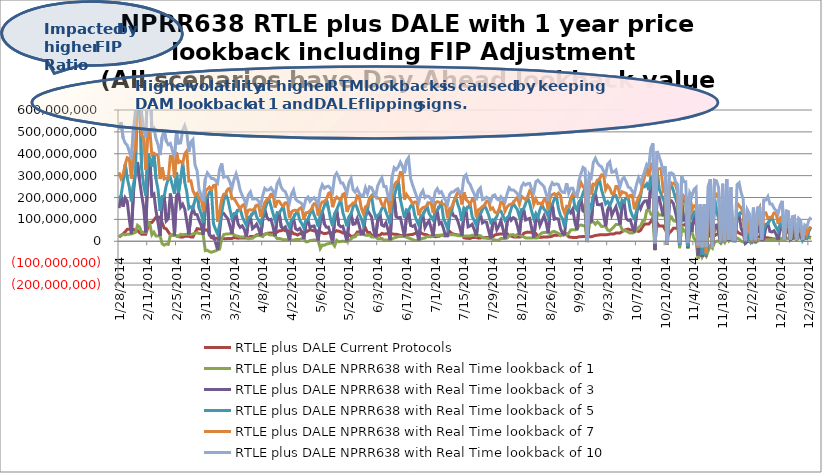
| Category | RTLE plus DALE Current Protocols | RTLE plus DALE NPRR638 with Real Time lookback of 1 | RTLE plus DALE NPRR638 with Real Time lookback of 3 | RTLE plus DALE NPRR638 with Real Time lookback of 5 | RTLE plus DALE NPRR638 with Real Time lookback of 7 | RTLE plus DALE NPRR638 with Real Time lookback of 10 |
|---|---|---|---|---|---|---|
| 1/28/14 | 18516424.113 | 20330707.317 | 151345566.711 | 194267535.615 | 315001352.258 | 510449728.574 |
| 1/29/14 | 26165652.225 | 28394407.036 | 209290560.988 | 209290560.988 | 286805051.687 | 544486130.82 |
| 1/30/14 | 33951592.112 | 30929923.618 | 158593541.433 | 270871903.741 | 305898755.766 | 471214211.662 |
| 1/31/14 | 43045783.01 | 29335787.17 | 198404084.302 | 351010505.149 | 351010505.149 | 449435839.337 |
| 2/1/14 | 54769080.035 | 32079503.261 | 182444401.404 | 288568876.6 | 381832253.594 | 438304825.56 |
| 2/2/14 | 54769080.035 | 32477531.017 | 100375771.106 | 247352723.153 | 378514968.837 | 410881427.76 |
| 2/3/14 | 54769080.035 | 32958092.885 | 32958092.885 | 181744694.462 | 286806381.395 | 378995530.705 |
| 2/4/14 | 54867904.896 | 37097715.499 | 218691239.193 | 258263628.802 | 395609754.08 | 508478816.403 |
| 2/5/14 | 44459964.79 | 40359369.437 | 311094978.796 | 311094978.796 | 420896675.799 | 594026171.099 |
| 2/6/14 | 48889341.468 | 72675738.867 | 362198280.329 | 643759064.74 | 707493834.426 | 993655725.667 |
| 2/7/14 | 39654347.796 | 64970253.927 | 278946250.254 | 699083454.768 | 699083454.768 | 971623958.546 |
| 2/8/14 | 32006154.249 | 39934503.455 | 212222773.758 | 332959676.231 | 483853013.206 | 586670284.027 |
| 2/9/14 | 32006154.249 | 40981731.458 | 155738895.703 | 256948164.716 | 474616851.646 | 507620672.726 |
| 2/10/14 | 32006154.249 | 40916190.632 | 40916190.632 | 209350489.46 | 327038241.942 | 474551310.82 |
| 2/11/14 | 63028979.82 | 87927844.322 | 308642414.784 | 401999687.803 | 503192402.154 | 728062333.704 |
| 2/12/14 | 85547610.904 | 79537844.16 | 375582470.159 | 375582470.159 | 506016148.574 | 763431237.924 |
| 2/13/14 | 85937272.747 | 29348735.909 | 208599565.803 | 341747944.915 | 396115730.063 | 505158660.665 |
| 2/14/14 | 97417042.342 | 41262300.775 | 215989249.577 | 402590811.167 | 402590811.167 | 515454131.563 |
| 2/15/14 | 109654336.546 | 24218108.647 | 138840936.911 | 285133676.496 | 395301117.933 | 468952261.305 |
| 2/16/14 | 109654336.546 | 24484932.818 | 85163582.601 | 235201437.643 | 394967266.468 | 441223520.774 |
| 2/17/14 | 109654336.546 | 24794770.497 | 24794770.497 | 138660851.252 | 284303849.806 | 393970296.74 |
| 2/18/14 | 84640835.996 | -11290271.301 | 167478037.681 | 204811356.556 | 337790670.788 | 476041026.148 |
| 2/19/14 | 60344140.354 | -17397708.767 | 206949939.56 | 206949939.56 | 284692722.486 | 507561405.727 |
| 2/20/14 | 56842811.04 | -12475554.518 | 92984535.263 | 254569850.251 | 288782354.897 | 457777882.832 |
| 2/21/14 | 42485541.507 | -14148140.001 | 102665682.394 | 285933411.007 | 285933411.007 | 441071128.325 |
| 2/22/14 | 29104966.55 | 27487991.19 | 217716432.548 | 290388546.838 | 387649237.601 | 447078296.967 |
| 2/23/14 | 29104966.55 | 27327032.055 | 150066010.705 | 255309669.456 | 387339087.376 | 414902291.627 |
| 2/24/14 | 29104966.55 | 26732602.836 | 26732602.836 | 216887267.133 | 289526103.69 | 386744658.157 |
| 2/25/14 | 23864162.506 | 25904433.162 | 207215218.911 | 314935981.209 | 405875778.09 | 495179155.175 |
| 2/26/14 | 21068769.319 | 22962403.588 | 223021497.881 | 223021497.881 | 359796534.422 | 447815274.077 |
| 2/27/14 | 19355877.946 | 31949081.19 | 155649601.338 | 284306538.797 | 364363115.337 | 449668883.838 |
| 2/28/14 | 18802534.063 | 29381985.458 | 169129150.79 | 355118534.124 | 355118534.124 | 505635708.191 |
| 3/1/14 | 23128178.094 | 30939116.203 | 147255303.008 | 269190832.453 | 399478222.496 | 528165907.634 |
| 3/2/14 | 23128178.094 | 32204613.198 | 89689180.811 | 226139721.968 | 412548824.967 | 498574966.452 |
| 3/3/14 | 23128178.094 | 31348157.695 | 31348157.695 | 150339671.89 | 275076523.786 | 408383374.233 |
| 3/4/14 | 19411967.958 | 30943641.771 | 116953093.664 | 157709491.879 | 276216245.475 | 453379870.294 |
| 3/5/14 | 19581333.766 | 33466239.239 | 150910025.202 | 150910025.202 | 231301701.625 | 464331142.325 |
| 3/6/14 | 38369816.469 | 34329404.266 | 123097372.651 | 188645014.77 | 210856436.751 | 348997538.712 |
| 3/7/14 | 57550185.653 | 40094816.396 | 121830532.859 | 219101540.859 | 219101540.859 | 323238199.091 |
| 3/8/14 | 56044264.844 | 35218835.025 | 94395349.335 | 151249373.934 | 195852348.264 | 236025138.006 |
| 3/9/14 | 56044264.844 | 35300358.394 | 74557793.723 | 125723641.615 | 195933871.633 | 210235666.693 |
| 3/10/14 | 56044264.844 | 29449859.371 | 29449859.371 | 85707170.802 | 139705670.744 | 182183000.158 |
| 3/11/14 | 50786282.858 | -42889280.836 | 165992305.302 | 191872962.849 | 228441513.468 | 284190820.857 |
| 3/12/14 | 52394012.107 | -41264388.234 | 200998782.457 | 200998782.457 | 238508988.509 | 312694670.522 |
| 3/13/14 | 35279158.185 | -47310402.091 | 27709311.952 | 223055781.824 | 247219083.917 | 299870339.026 |
| 3/14/14 | 16658128.226 | -50383602.616 | 20174490.671 | 234547850.138 | 234547850.138 | 287310521.204 |
| 3/15/14 | 13706829.115 | -46835789.758 | 23712364.396 | 79935691.93 | 254521376.051 | 286518839.583 |
| 3/16/14 | 13706829.115 | -44379586.745 | -5390284.796 | 54066937.675 | 257142282.732 | 278498679.294 |
| 3/17/14 | 13706829.115 | -39457819.562 | -39457819.562 | 32409289.621 | 89597685.585 | 265948693.348 |
| 3/18/14 | 10367868.111 | -35578330.004 | 44332940.342 | 77083958.941 | 136297324.088 | 330056072.263 |
| 3/19/14 | 12220663.599 | 11683350.999 | 129918321.135 | 129918321.135 | 190675357.713 | 355377404.656 |
| 3/20/14 | 12280244.26 | 30500698.378 | 127199190.632 | 185077942.157 | 214653058.661 | 292837367.341 |
| 3/21/14 | 11383137.771 | 32586600.935 | 114067065.475 | 215889114.824 | 215889114.824 | 296548795.944 |
| 3/22/14 | 12942133.313 | 33093199.604 | 102891457.971 | 191438655.544 | 238271775.826 | 292083951.455 |
| 3/23/14 | 12942133.313 | 34331268.365 | 70275780.379 | 146976522.983 | 242214168.848 | 270432072.315 |
| 3/24/14 | 12942133.313 | 34579995.319 | 34579995.319 | 105215602.911 | 194817017.305 | 242462895.802 |
| 3/25/14 | 17287550.961 | 29790236.143 | 101960345.579 | 126532667.982 | 195015243.345 | 282539043.818 |
| 3/26/14 | 15207576.706 | 24241623.182 | 126153376.818 | 126153376.818 | 180334330.09 | 308005334.037 |
| 3/27/14 | 14204179.027 | 23001950.163 | 78774787.099 | 141435129.602 | 164031683.592 | 276382365.238 |
| 3/28/14 | 14449424.791 | 19741529.358 | 63696800.838 | 148720959.66 | 148720959.66 | 232588634.065 |
| 3/29/14 | 14431130.416 | 19637663.433 | 70537334.464 | 113206581.612 | 163186682.571 | 209704343.971 |
| 3/30/14 | 14431130.416 | 20364444.161 | 54461868.584 | 91304262.38 | 168585635.838 | 189683646.695 |
| 3/31/14 | 14431130.416 | 20428521.271 | 20428521.271 | 73063213.305 | 116893386.99 | 168649712.948 |
| 4/1/14 | 16995874.674 | 10576032.151 | 90406584.477 | 110258573.343 | 142339748.009 | 212273950.765 |
| 4/2/14 | 21725595.053 | 13406497.093 | 110788982.915 | 110788982.915 | 144091758.311 | 225781401.825 |
| 4/3/14 | 21760578.006 | 13541488.374 | 57688652.89 | 123861917.334 | 142048439.821 | 193143951.668 |
| 4/4/14 | 22200325.638 | 21827466.862 | 65643668.586 | 147608090.452 | 147608090.452 | 193642725.931 |
| 4/5/14 | 29239053.06 | 25273361.292 | 78098778.658 | 112341049.148 | 164729618.647 | 194602646.354 |
| 4/6/14 | 29239053.06 | 26403781.195 | 56769799.208 | 94977271.675 | 166183636.242 | 182808174.795 |
| 4/7/14 | 29239053.06 | 25162398.533 | 25162398.533 | 77823498.64 | 112002226.022 | 164177199.381 |
| 4/8/14 | 29183939.861 | 21113335.502 | 98073620.108 | 115743589.191 | 147798591.928 | 209019311.299 |
| 4/9/14 | 31253222.94 | 32799715.113 | 143278262.361 | 143278262.361 | 177052710.023 | 241416294.835 |
| 4/10/14 | 35731584.745 | 35552065.561 | 110054527.588 | 174972402.969 | 190579396.71 | 233561291.054 |
| 4/11/14 | 37383103.331 | 30307261.946 | 97853106.109 | 193380323.197 | 193380323.197 | 235044641.958 |
| 4/12/14 | 37762809.86 | 28912788.212 | 100438186.36 | 160802816.094 | 215407523.115 | 244551735.432 |
| 4/13/14 | 37762809.86 | 28889822.141 | 65960947.354 | 126626771.079 | 215384557.045 | 229889644.717 |
| 4/14/14 | 37762809.86 | 23773362.789 | 23773362.789 | 94508720.289 | 154255133.298 | 208287581.911 |
| 4/15/14 | 41320322.684 | 12327138.032 | 103617829.081 | 130601223.802 | 183120002.022 | 262679939.998 |
| 4/16/14 | 47764436.788 | 12245751.842 | 129141763.301 | 129141763.301 | 182632370.004 | 280280269.209 |
| 4/17/14 | 48480241.035 | 10579896.282 | 65344864.78 | 143280242.43 | 168357500.501 | 246227855.479 |
| 4/18/14 | 52261334.29 | 7024090.819 | 58422303.914 | 159940240.967 | 159940240.967 | 232721981.586 |
| 4/19/14 | 48076803.709 | 6778535.387 | 65579151.337 | 107018478.159 | 175860549.16 | 226526744.334 |
| 4/20/14 | 48076803.709 | 7179964.506 | 39714358.627 | 85016676.541 | 176261978.279 | 200692328.9 |
| 4/21/14 | 48076803.709 | 4153226.04 | 4153226.04 | 63685157.275 | 105612796.86 | 175007594.656 |
| 4/22/14 | 45342148.746 | 5694396.291 | 80354618.02 | 98390299.966 | 134383301.41 | 216137374.288 |
| 4/23/14 | 34456654.042 | 4973246.086 | 105963014.846 | 105963014.846 | 140923031.595 | 234349025.426 |
| 4/24/14 | 32702431.172 | 7759090.79 | 56927492.941 | 125047454.376 | 141541872.433 | 192659061.624 |
| 4/25/14 | 28520085.338 | 7885366.298 | 51194187.357 | 137128954.139 | 137128954.139 | 183157172.832 |
| 4/26/14 | 34704659.752 | 8461343.281 | 58448462.156 | 96502633.084 | 149750876.306 | 178813794.957 |
| 4/27/14 | 34704659.752 | 11362602.301 | 42700018.178 | 80736975.721 | 155507704.837 | 171035903.602 |
| 4/28/14 | 34704659.752 | 11031957.514 | 11031957.514 | 62023428.867 | 100802426.943 | 154999658.777 |
| 4/29/14 | 42270405.843 | -1768458.088 | 77026668.671 | 96390929.803 | 130540897.025 | 192648715.944 |
| 4/30/14 | 46844133.068 | -1861365.496 | 98641990.05 | 98641990.05 | 131222204.721 | 202288764.683 |
| 5/1/14 | 52461928.948 | 2955809.44 | 61650820.891 | 123708906.943 | 138895310.253 | 182188043.636 |
| 5/2/14 | 50123324.586 | 4121970.598 | 68313802.911 | 150835000.303 | 150835000.303 | 192285428.547 |
| 5/3/14 | 47294111.154 | 6118761.486 | 69804679.189 | 120176107.277 | 171849447.385 | 199177510.366 |
| 5/4/14 | 47294111.154 | 5991724.113 | 40167117.367 | 98190683.996 | 171722410.012 | 185586032.032 |
| 5/5/14 | 47294111.154 | 2998231.56 | 2998231.56 | 66938073.764 | 117409341.606 | 169226054.588 |
| 5/6/14 | 43241075.89 | -33514094.92 | 89747775.54 | 114245507.753 | 165762492.711 | 231831231.608 |
| 5/7/14 | 38024569.058 | -17398770.789 | 135992097.679 | 135992097.679 | 179788597.53 | 258088008.523 |
| 5/8/14 | 34800096.191 | -18256059.977 | 78567550.376 | 161491801.028 | 180738755.623 | 241863968.51 |
| 5/9/14 | 36025740.274 | -13089128.545 | 63750546.089 | 191822001.505 | 191822001.505 | 249768033.016 |
| 5/10/14 | 39347436.698 | -11248865.863 | 64587406.562 | 149510964.761 | 217820134.852 | 251896406.546 |
| 5/11/14 | 39347436.698 | -8979096.734 | 31134619.38 | 102143925.152 | 224555529.116 | 241624644.138 |
| 5/12/14 | 39347436.698 | -8460095.316 | -8460095.316 | 68961271.329 | 155782339.952 | 225074530.534 |
| 5/13/14 | 41773531.356 | -21761133.597 | 95568528.25 | 126333705.902 | 188748388.902 | 297123630.982 |
| 5/14/14 | 48505784.744 | 4281087.89 | 144156543.825 | 144156543.825 | 201723726.661 | 311524676.037 |
| 5/15/14 | 45934095.2 | -2409405.215 | 74942856.27 | 167164059.509 | 194189421.453 | 293352161.235 |
| 5/16/14 | 43115859.464 | -1283873.339 | 66044985.501 | 187980444.83 | 187980444.83 | 266600072.78 |
| 5/17/14 | 37879502.938 | 476193.339 | 68623506.647 | 131623338.919 | 214653351.444 | 265891023.172 |
| 5/18/14 | 37879502.938 | -1280018.021 | 36024142.272 | 100916202.732 | 218778157.027 | 244786849.232 |
| 5/19/14 | 37879502.938 | -2233213.085 | -2233213.085 | 68528079.171 | 133796921.324 | 220007359.507 |
| 5/20/14 | 31479478.931 | 1756288.255 | 90136857.161 | 112356200.365 | 159029332.125 | 268791126.149 |
| 5/21/14 | 21917221.765 | 10521656.659 | 125295090.383 | 125295090.383 | 164584467.492 | 287253772.74 |
| 5/22/14 | 23149774.758 | 19325902.387 | 77483163.224 | 156870225.188 | 174955870.223 | 235309490.292 |
| 5/23/14 | 27018629.19 | 20025854.416 | 79593818.499 | 173981994.839 | 173981994.839 | 224369381.602 |
| 5/24/14 | 41753703.106 | 32048311.308 | 103590486.574 | 150977705.664 | 207647411.676 | 240494429.848 |
| 5/25/14 | 41753703.106 | 31360930.55 | 70797980.715 | 123256098.335 | 203732080.951 | 219415194.477 |
| 5/26/14 | 41753703.106 | 33298997.517 | 33298997.517 | 104226050.21 | 151257803.52 | 207301960.494 |
| 5/27/14 | 45655421.223 | 33477559.044 | 33477559.044 | 73475538.339 | 126653355.362 | 208130553.258 |
| 5/28/14 | 60459345.103 | 27600622.36 | 110489707.13 | 110489707.13 | 156973569.032 | 243934230.918 |
| 5/29/14 | 40733572.672 | 26669355.518 | 142518624.332 | 142518624.332 | 164233051.315 | 217536833.382 |
| 5/30/14 | 40432535.228 | 28903068.955 | 125816001.461 | 195140799.983 | 195140799.983 | 248907077.798 |
| 5/31/14 | 27420726.578 | 19460097.393 | 111483281.215 | 207284858.55 | 207284858.55 | 245040676.711 |
| 6/1/14 | 27420726.578 | 18896182.954 | 50267203.893 | 141786678.186 | 205414284.015 | 224257880.031 |
| 6/2/14 | 27420726.578 | 18913885.544 | 18913885.544 | 110344112.329 | 205522190.832 | 205522190.832 |
| 6/3/14 | 27652186.316 | 11883209.481 | 97947041.684 | 117962015.474 | 197214913.825 | 253674058.031 |
| 6/4/14 | 27080747.919 | 11814608.96 | 125600202.492 | 125600202.492 | 195522139.422 | 274619180.166 |
| 6/5/14 | 35976375.944 | 12924126.557 | 74070629.935 | 149665731.484 | 168113287.153 | 290501426.451 |
| 6/6/14 | 32569559.521 | 4917092.93 | 69126718.922 | 161395570.956 | 161395570.956 | 250619949.099 |
| 6/7/14 | 34048554.466 | 5791821.283 | 84688457.608 | 134279278.432 | 191210427.855 | 250747439.744 |
| 6/8/14 | 34048554.466 | 5767002.492 | 52268533.303 | 108812695.899 | 191185609.064 | 207008384.564 |
| 6/9/14 | 34048554.466 | 4938469.944 | 4938469.944 | 81435476.01 | 129643020.933 | 185014566.553 |
| 6/10/14 | 34307735.552 | 10755308.146 | 153356913.351 | 185286805.087 | 227135597.554 | 293750962.693 |
| 6/11/14 | 31458153.385 | 15176189.963 | 203801825.971 | 203801825.971 | 255736378.255 | 336205268.652 |
| 6/12/14 | 31697789.311 | 17948806.254 | 110891859.354 | 240597835.719 | 270531571.695 | 327094212.102 |
| 6/13/14 | 29940017.488 | 21333203.533 | 107593344.907 | 275266919.593 | 275266919.593 | 340264460.239 |
| 6/14/14 | 26652265.383 | 21533288.446 | 108759291.531 | 192339363.5 | 314138361.154 | 361609590.821 |
| 6/15/14 | 26652265.383 | 21648610.588 | 66587305.091 | 149435201.629 | 314253683.296 | 343696849.783 |
| 6/16/14 | 26652265.383 | 21378161.414 | 21378161.414 | 107783381.453 | 190543642.17 | 311120045.909 |
| 6/17/14 | 26459191.366 | 18510154.16 | 112681468.617 | 144018984.505 | 214101691.583 | 367938037.89 |
| 6/18/14 | 28881956.705 | 14512455.251 | 139073565.409 | 139073565.409 | 200511862.546 | 382322208.871 |
| 6/19/14 | 30255623.928 | 11652935.826 | 72263387.482 | 160015055.443 | 188709063.102 | 287577382.154 |
| 6/20/14 | 30840644.322 | 7320249.485 | 67792354.894 | 170451096.887 | 170451096.887 | 256722990.457 |
| 6/21/14 | 35189758.46 | 3849857.99 | 73352490.426 | 119073990.778 | 179201394.1 | 229954334.129 |
| 6/22/14 | 35189758.46 | 3964269.064 | 41713414.22 | 92859612.511 | 179047647.292 | 203403916.849 |
| 6/23/14 | 35189758.46 | 3931867.52 | 3931867.52 | 73354770.751 | 119001179.877 | 179015245.749 |
| 6/24/14 | 39439469.087 | 10786502.291 | 94650823.549 | 114941680.833 | 144916528.294 | 215995245.533 |
| 6/25/14 | 32973110.16 | 13365902.707 | 119518947.155 | 119518947.155 | 153744506.598 | 231177749.889 |
| 6/26/14 | 31027085.966 | 15056891.754 | 62618399.782 | 138535202.793 | 156488840.603 | 199524146.454 |
| 6/27/14 | 29344690.16 | 21471008.118 | 80973761.097 | 163740501.255 | 163740501.255 | 206382293.644 |
| 6/28/14 | 23544131 | 20669799.717 | 93591864.43 | 126372119.537 | 175473170.729 | 204193195.534 |
| 6/29/14 | 23544131 | 20660765.319 | 60619222.633 | 111130044.114 | 175464136.332 | 190731700.181 |
| 6/30/14 | 23544131 | 23421918.107 | 23421918.107 | 96598275.789 | 129486155.776 | 178692317.539 |
| 7/1/14 | 20291486.335 | 27589114.757 | 116729778.994 | 138356497.494 | 176143275.522 | 226440382.42 |
| 7/2/14 | 22193605.985 | 26510455.234 | 139522991.343 | 139522991.343 | 180826755.661 | 240566400.331 |
| 7/3/14 | 23245175.547 | 27175491.848 | 79298275.903 | 157620477.982 | 177332820.569 | 220722458.711 |
| 7/4/14 | 28023459.45 | 26782288.959 | 86136100.712 | 174957322.669 | 174957322.669 | 226664301.423 |
| 7/5/14 | 28637179.076 | 25376959.866 | 59362697.91 | 105964894.151 | 168824955.238 | 205692128.063 |
| 7/6/14 | 28637179.076 | 25175862.803 | 25175862.803 | 82792587.424 | 168655678.841 | 187502953.109 |
| 7/7/14 | 28637179.076 | 24803798.713 | 24803798.713 | 58794419.714 | 105412024.395 | 168283614.752 |
| 7/8/14 | 44730073.562 | 29713478.051 | 111112094.362 | 111112094.362 | 149103863.439 | 214232813.296 |
| 7/9/14 | 35456377.728 | 30250721.742 | 136682468.39 | 136682468.39 | 155807319.01 | 225422000.162 |
| 7/10/14 | 32811614.724 | 29295050.764 | 115778578.4 | 180491876.237 | 180491876.237 | 225747157.488 |
| 7/11/14 | 30887361.04 | 28129468.988 | 113441683.869 | 202040208.928 | 202040208.928 | 234857461.867 |
| 7/12/14 | 28572094.228 | 25673831.81 | 92388350.431 | 169274842.845 | 223631962.849 | 239741048.227 |
| 7/13/14 | 28572094.228 | 25180711.123 | 61033289.661 | 141548648.463 | 221038135.075 | 221038135.075 |
| 7/14/14 | 28572094.228 | 26021018.042 | 26021018.042 | 92041440.223 | 168137474.238 | 222014309.127 |
| 7/15/14 | 15936132.677 | 23262086.915 | 125110065.944 | 152062439.102 | 223738887.55 | 293610818.597 |
| 7/16/14 | 14104326.105 | 23851107.856 | 142750390.983 | 142750390.983 | 190804428.491 | 304059196.145 |
| 7/17/14 | 13319048.195 | 23778083.195 | 65997603.87 | 155606540.948 | 180943892.749 | 271456832.157 |
| 7/18/14 | 12719494.979 | 23650223.257 | 70226738.355 | 168754575.464 | 168754575.464 | 259889446.033 |
| 7/19/14 | 17189810.102 | 27433363.787 | 77555580.249 | 112578045.362 | 191012899.334 | 236115162.275 |
| 7/20/14 | 17189810.102 | 27257027.92 | 53137825.952 | 94457863.773 | 192143564.8 | 216588813.226 |
| 7/21/14 | 17189810.102 | 23716008.263 | 23716008.263 | 73969376.494 | 108969102.37 | 187690384.222 |
| 7/22/14 | 14136580.808 | 27042233.857 | 99674116.134 | 118856836.699 | 143732223.906 | 233095499.395 |
| 7/23/14 | 15343458.257 | 24928408.761 | 123597210.483 | 123597210.483 | 149094877.32 | 244346446.87 |
| 7/24/14 | 15669750.178 | 17804085.118 | 83762842.614 | 144471010.983 | 158893922.462 | 189950060.012 |
| 7/25/14 | 16738140.67 | 15305815.338 | 89805346.863 | 164818909.567 | 164818909.567 | 193803266.134 |
| 7/26/14 | 17435055.202 | 13371082.678 | 87167874.227 | 145537823.335 | 182460366.276 | 201552246.226 |
| 7/27/14 | 17435055.202 | 12751844.082 | 49137762.375 | 119938007.023 | 182667063.967 | 195639817.591 |
| 7/28/14 | 17435055.202 | 13503350.118 | 13503350.118 | 87340251.32 | 145638491.227 | 182629740.812 |
| 7/29/14 | 19934047.529 | 7670107.789 | 80338700.907 | 98424101.52 | 152181594.159 | 208134944.017 |
| 7/30/14 | 28658407.342 | 5778837.905 | 95938923.714 | 95938923.714 | 133570859.08 | 212044101.266 |
| 7/31/14 | 30651584.55 | 4547377.371 | 52711659.853 | 113870350.99 | 128541338.301 | 193535317.437 |
| 8/1/14 | 32682900.11 | 5614086.465 | 69368557.665 | 141740107.142 | 141740107.142 | 188386844.928 |
| 8/2/14 | 33434043.259 | 12596600.133 | 94758262.915 | 137725786.696 | 179798365.953 | 203888627.321 |
| 8/3/14 | 33434043.259 | 12586147.331 | 55609253.096 | 117067222.757 | 179787913.151 | 191749609.185 |
| 8/4/14 | 33434043.259 | 12720715.944 | 12720715.944 | 94882378.726 | 137849902.507 | 179922481.764 |
| 8/5/14 | 34687473.314 | 14534325.248 | 82332030.665 | 107804653.051 | 157476582.48 | 216772025.85 |
| 8/6/14 | 26485753.544 | 24570610.047 | 116138616.439 | 116138616.439 | 166863040.364 | 244783507.705 |
| 8/7/14 | 23529254.53 | 29850942.753 | 96382866.946 | 149272371.349 | 170144515.119 | 234307341.016 |
| 8/8/14 | 20040978.708 | 30376326.544 | 107746253.785 | 174897374.546 | 174897374.546 | 234482342.51 |
| 8/9/14 | 19000665.71 | 23852290.309 | 102494649.729 | 157965151.364 | 189225938.37 | 227761053.95 |
| 8/10/14 | 19000665.71 | 31383753.801 | 70686052.565 | 144504642.16 | 200602794.526 | 217140407.762 |
| 8/11/14 | 19000665.71 | 31332043.037 | 31332043.037 | 111887455.927 | 168776674.982 | 200551083.762 |
| 8/12/14 | 21273019.686 | 23538009.354 | 119799194.204 | 145058696.022 | 205453079.803 | 249045186.253 |
| 8/13/14 | 35032331.561 | 20501638.849 | 147256074.382 | 147256074.382 | 197520276.037 | 265176747.581 |
| 8/14/14 | 39657464.93 | 15379127.692 | 97239696.826 | 171933390.324 | 190527797.157 | 256756472.252 |
| 8/15/14 | 41880532.165 | 14529132.808 | 101279823.311 | 201300947.664 | 201300947.664 | 263316639.21 |
| 8/16/14 | 40803351.468 | 14927624.303 | 104413077.378 | 173994950.243 | 229969807.121 | 264556467.462 |
| 8/17/14 | 40803351.468 | 14419653.891 | 57721435.807 | 136401347.447 | 221643223.658 | 235876096.472 |
| 8/18/14 | 40803351.468 | 15874684.623 | 15874684.623 | 102011366.245 | 169065288.102 | 222958556.651 |
| 8/19/14 | 35701332.087 | 14522683.942 | 95640190.055 | 126567768.612 | 193647329.5 | 271981939.867 |
| 8/20/14 | 19854256.232 | 15675940.577 | 108556569.204 | 108556569.204 | 172245185.254 | 279144562.917 |
| 8/21/14 | 17446721.223 | 31341721.992 | 71804530.164 | 143733902.847 | 174094505.67 | 267522489.371 |
| 8/22/14 | 18451911.239 | 38300895.603 | 93582552.256 | 166844935.483 | 166844935.483 | 259921054.865 |
| 8/23/14 | 19963864.957 | 39866196.201 | 115914796.684 | 146750750.11 | 190433299.043 | 248953415.954 |
| 8/24/14 | 19963864.957 | 41515426.233 | 86512428.433 | 135579361.026 | 191068667.267 | 217664283.171 |
| 8/25/14 | 19963864.957 | 37855177.43 | 37855177.43 | 112603411.393 | 142967320.667 | 185951354.091 |
| 8/26/14 | 20358836.479 | 34114642.342 | 139623362.519 | 168337249.3 | 204064527.926 | 245708250.076 |
| 8/27/14 | 23270172.216 | 43219613.933 | 167646648.911 | 167646648.911 | 212986103.052 | 267535171.012 |
| 8/28/14 | 27699277.157 | 44992536.855 | 100832839.919 | 192370610.238 | 217697851.212 | 257892242.024 |
| 8/29/14 | 26761396.342 | 39915501.542 | 103600904.634 | 206762710.381 | 206762710.381 | 262500846.813 |
| 8/30/14 | 28039537.064 | 36338967.542 | 101932123.306 | 150343857.518 | 219658175.475 | 259452924.655 |
| 8/31/14 | 28039537.064 | 25811808.135 | 57493125.134 | 117732011.321 | 209840160.688 | 233131163.515 |
| 9/1/14 | 28039537.16 | 35493990.228 | 35493990.228 | 103038347.5 | 152909754.558 | 224202267.006 |
| 9/2/14 | 29805546.02 | 34075061.902 | 34075061.902 | 66570480.285 | 128352047.239 | 222697912.216 |
| 9/3/14 | 33834025.24 | 28248220.719 | 120595773.697 | 120595773.697 | 159998391.111 | 265303270.73 |
| 9/4/14 | 20297749.21 | 36549283.783 | 141606516.586 | 141606516.586 | 157453742.467 | 219637651.352 |
| 9/5/14 | 18289222.64 | 51918474.863 | 129891328.209 | 194599975.742 | 194599975.742 | 242664069.039 |
| 9/6/14 | 17543270.52 | 52442932.211 | 147348472.686 | 213844982.177 | 213844982.177 | 242010605.804 |
| 9/7/14 | 17543270.52 | 53059235.567 | 87681149.814 | 156324544.61 | 205747133.17 | 217289190.636 |
| 9/8/14 | 17543270.52 | 53169347.254 | 53169347.254 | 143001780.804 | 206019227.058 | 206019227.058 |
| 9/9/14 | 20438135.01 | 72404443.456 | 152908100.248 | 180859831.862 | 240864754.796 | 277414237.373 |
| 9/10/14 | 20874846.85 | 74405535.392 | 191989592.751 | 191989592.751 | 268308759.163 | 309586731.738 |
| 9/11/14 | 21959932.71 | 71455286.737 | 138266180.848 | 219693761.287 | 248453653.172 | 337310451.406 |
| 9/12/14 | 21584530.54 | 70892947.4 | 132451732.214 | 244639105.939 | 244639105.939 | 330905394.037 |
| 9/13/14 | 20775752.43 | -3844023.726 | -3657249.692 | -2536678.075 | -2277886.74 | -2182414.166 |
| 9/14/14 | 20775752.43 | 78474401.517 | 112666161.161 | 170777469.919 | 277628544.8 | 305517957.818 |
| 9/15/14 | 20775752.43 | 87260368.937 | 87260368.937 | 154151602.655 | 214759559.41 | 291697230.174 |
| 9/16/14 | 23329629.79 | 89022245.706 | 192743342.492 | 211836093.83 | 261247693.166 | 360341442.391 |
| 9/17/14 | 26588089.57 | 77909491.983 | 218899295.106 | 218899295.106 | 259197277.464 | 379141815.207 |
| 9/18/14 | 27303352.99 | 88783918.226 | 167779510.941 | 261592550.667 | 279863413.99 | 358178290.033 |
| 9/19/14 | 29173970.41 | 79648742.526 | 166902937.022 | 282671298.837 | 282671298.837 | 345505220.213 |
| 9/20/14 | 29711451.86 | 67521946.526 | 170253007.211 | 235210669.279 | 303566738.235 | 340272287.933 |
| 9/21/14 | 29711451.86 | 68704251.29 | 120707217.843 | 202376748.213 | 304249236.137 | 321009590.576 |
| 9/22/14 | 29711451.86 | 68869964.1 | 68869964.1 | 171140272.416 | 235832674.263 | 303934540.28 |
| 9/23/14 | 30462955.64 | 51034258.033 | 144013290.803 | 181094306.499 | 254552027.026 | 352748931.121 |
| 9/24/14 | 32942502.9 | 48620605.131 | 165394309.023 | 165394309.023 | 242674500.353 | 363330141.138 |
| 9/25/14 | 32749126.57 | 55983620.411 | 118321120.867 | 184072761.802 | 218184942.689 | 315354955.365 |
| 9/26/14 | 32830928.23 | 65966234.491 | 139300817.15 | 215696358.965 | 215696358.965 | 317449224.705 |
| 9/27/14 | 38007422.47 | 76238626.796 | 157692539.657 | 208803606.342 | 249966465.921 | 325542402.492 |
| 9/28/14 | 38007422.47 | 76113137.315 | 118853559.735 | 182108059.745 | 249840976.44 | 283560398.87 |
| 9/29/14 | 38007422.47 | 76365848.6 | 76365848.6 | 157367351.718 | 208083731.82 | 249033927.44 |
| 9/30/14 | 44115170.49 | 53592543.419 | 161760053.95 | 187718542.396 | 226407733.17 | 282115251.914 |
| 10/1/14 | 50636279.98 | 47182435.968 | 180038914.536 | 180038914.536 | 222254760.26 | 291648863.173 |
| 10/2/14 | 53176920.19 | 48487454.768 | 103407860.416 | 197611998.337 | 219236856.743 | 272234141.652 |
| 10/3/14 | 55609719.16 | 41205104.594 | 95434744.431 | 199025614.305 | 199025614.305 | 247597148.276 |
| 10/4/14 | 51951274.04 | 37606447.112 | 97972306.685 | 142301799.729 | 210663391.735 | 243442143.253 |
| 10/5/14 | 51951274.04 | 37502936.507 | 66552356.122 | 117286050.013 | 210559881.13 | 228206336.956 |
| 10/6/14 | 51951274.04 | 41417230.895 | 41417230.895 | 101730902.551 | 146054596.662 | 214613553.875 |
| 10/7/14 | 49003616.39 | 49631891.262 | 119948176.96 | 135710739.282 | 174556972.714 | 259326981.181 |
| 10/8/14 | 44781022.18 | 63353532.823 | 169046475.369 | 169046475.369 | 201607811.68 | 290151792.453 |
| 10/9/14 | 49819481.04 | 68888966.235 | 148475801.803 | 206530315.178 | 218171517.221 | 267258645.577 |
| 10/10/14 | 66693516.1 | 91676381.647 | 171966366.079 | 256864624.17 | 256864624.17 | 293430871.267 |
| 10/11/14 | 78328371.66 | 95600060.504 | 183850790.309 | 250040188.26 | 296608380.017 | 320297408.783 |
| 10/12/14 | 78328371.66 | 140927710.742 | 184833990.313 | 262080604.205 | 341170491.375 | 350947402.091 |
| 10/13/14 | 78328371.66 | 147493230.617 | 147493230.617 | 233942298.954 | 297427089.103 | 341946353.375 |
| 10/14/14 | 89884609.41 | 124227457.48 | 261735062.853 | 291833636.724 | 353744634.856 | 424348398.316 |
| 10/15/14 | 107590362.39 | 117816023.827 | 288053729.152 | 288053729.152 | 350015866.397 | 447463712.195 |
| 10/16/14 | 106587412.84 | -40836973.922 | -39941207.063 | -12637664.658 | -12551678.626 | -8398398.523 |
| 10/17/14 | 85130927.04 | 134740059.496 | 197041605.351 | 328098381.31 | 328098381.31 | 412064002.144 |
| 10/18/14 | 70074284.39 | 120274831.257 | 199996580.443 | 239581193.13 | 331580974.052 | 388177577.292 |
| 10/19/14 | 70074284.39 | 120591840.668 | 159237150.572 | 216917299.469 | 331897983.463 | 359114872.34 |
| 10/20/14 | 70074284.39 | 116365645.52 | 116365645.52 | 192604152.957 | 230520049.519 | 319133886.378 |
| 10/21/14 | 53144116.22 | 116539640.618 | 183734528.239 | 203273442.2 | 246399516.637 | 342672609.154 |
| 10/22/14 | 38679585.33 | -17231460.061 | -13991539.321 | -13991539.321 | -13486892.241 | -11844521.955 |
| 10/23/14 | 37833720.82 | 112301271.724 | 182093926.503 | 239341897.988 | 256157473.049 | 310681985.955 |
| 10/24/14 | 46890201.03 | 112271193.092 | 184767977.446 | 258760007.078 | 258760007.078 | 312517478.555 |
| 10/25/14 | 59496065.05 | 94794924.888 | 172078765.213 | 230455248.9 | 265625395.337 | 306562040.744 |
| 10/26/14 | 59496065.05 | 90866172.237 | 131676486.013 | 198202956.451 | 258688727.225 | 273086603.759 |
| 10/27/14 | 59496065.05 | 90622221.256 | 90622221.256 | 167622018.259 | 225732626.234 | 260648927.007 |
| 10/28/14 | 64044407.45 | -31574566.905 | -17342696.513 | -16583208.712 | -9436390.743 | -6853396.923 |
| 10/29/14 | 73130038.18 | 66623588.455 | 180047019.788 | 180047019.788 | 218076700.981 | 300131981.198 |
| 10/30/14 | 74454102.68 | 46831120.152 | 97662970.301 | 183438542.161 | 199581087.992 | 271719320.166 |
| 10/31/14 | 77399479.64 | 51134672.01 | 105421655.334 | 207755249.984 | 207755249.984 | 271843570.529 |
| 11/1/14 | 78834628.62 | -33077723.294 | -31064222.394 | -22736196.01 | -9185467.175 | -8238133.449 |
| 11/2/14 | 78834628.62 | 43712604.199 | 78697807.601 | 121769272.827 | 206107296.76 | 221649067.761 |
| 11/3/14 | 78834628.62 | 42849185.176 | 42849185.176 | 106465370.023 | 142521431.152 | 205126369.817 |
| 11/4/14 | 83504454.25 | 13069770.811 | 119424465.41 | 133682827.335 | 162286240.511 | 236778284.185 |
| 11/5/14 | 88864611.37 | 5009890.405 | 136771794.817 | 136771794.817 | 164864048.062 | 245937197.215 |
| 11/6/14 | 81914369.86 | -81378308.405 | -65680109.926 | -30341852.934 | -29164021.874 | -20404280.825 |
| 11/7/14 | 71813118.15 | -41288047.474 | 23990764.28 | 134224547.033 | 134224547.033 | 169216035.197 |
| 11/8/14 | 57776478.26 | -72856323.493 | -71161814.658 | -60934726.756 | -28776113.154 | -27157536.287 |
| 11/9/14 | 57776478.26 | -56109435.838 | -11504553.641 | 53357044.627 | 156710588.075 | 168880937.519 |
| 11/10/14 | 57776478.26 | -68634855.93 | -68634855.93 | -66940347.095 | -56713259.193 | -24554645.591 |
| 11/11/14 | 46425368.01 | -42422580.6 | 70634113.812 | 107061294.803 | 165361377.462 | 253485639.859 |
| 11/12/14 | 22696187.27 | -20360635.97 | 124127286.63 | 124127286.63 | 195587885.889 | 284241320.293 |
| 11/13/14 | 22982070.41 | -31405619.963 | -30839953.929 | -30814967.939 | -30682836.229 | -29706836.446 |
| 11/14/14 | 24374422.09 | -4404613.997 | 72121098.418 | 196649104.17 | 196649104.17 | 279431705.615 |
| 11/15/14 | 32116949.43 | 318372.721 | 74095505.043 | 133866326.149 | 215885772.902 | 276077590.189 |
| 11/16/14 | 32116949.43 | 1123789.742 | 38455878.353 | 105699799.45 | 216361408.268 | 245695281.515 |
| 11/17/14 | 32116949.43 | -8933018.33 | -8933018.33 | -7944476.795 | -7469061.631 | -7444870.025 |
| 11/18/14 | 41356718.24 | 5382229.948 | 88165090.668 | 111717143.966 | 165516933.84 | 262753522.737 |
| 11/19/14 | 53598448.94 | -6513322.932 | -822043.244 | -822043.244 | -116621.414 | 351825.892 |
| 11/20/14 | 57338693.02 | 13429627.044 | 99605541.165 | 182876257.31 | 206489060.245 | 284858526.585 |
| 11/21/14 | 59629711.3 | 626770.924 | 1739632.061 | 6089016.249 | 6089016.249 | 6947586.427 |
| 11/22/14 | 51811668.13 | 12887526.022 | 81909235.579 | 149154454.802 | 207125872.798 | 247184007.449 |
| 11/23/14 | 51811668.13 | 1924149.2 | 2383933.095 | 3466758.065 | 7773783.454 | 8004836.007 |
| 11/24/14 | 51811668.13 | 1871529.346 | 1871529.346 | 2450404.86 | 6757825.625 | 7721163.6 |
| 11/25/14 | 44718957.52 | 15204399.842 | 105750471.432 | 128738245.635 | 174910683.777 | 258714076.352 |
| 11/26/14 | 36637578.51 | 9887320.131 | 120347583.493 | 120347583.493 | 162830444.811 | 267112398.368 |
| 11/27/14 | 32763178.14 | 795404.977 | 59785196.096 | 130856344.626 | 151569842.2 | 222149255.833 |
| 11/28/14 | 29474253.96 | -1412635.841 | 36319023.841 | 129478381.504 | 129478381.504 | 191261433.761 |
| 11/29/14 | 31232863.93 | -9804218.273 | -9804218.273 | 1671584.149 | 2484425.837 | 2895947.95 |
| 11/30/14 | 31232863.93 | -1173132.92 | -1173132.92 | 35129753.844 | 124356864.106 | 144246346.45 |
| 12/1/14 | 31232863.93 | -1272371.202 | -1272371.202 | -1272371.202 | 56314291.554 | 125751680.617 |
| 12/2/14 | 30465102.92 | -6304060.183 | -4616754.384 | -4616754.384 | 539699.385 | 5258296.293 |
| 12/3/14 | 19890836.48 | -1252804.327 | 86121186.044 | 86121186.044 | 86121186.044 | 153450653.809 |
| 12/4/14 | 17792648.05 | -5886124.429 | -4762071.647 | -3261165.578 | -3261165.578 | 5416751.565 |
| 12/5/14 | 19891799.14 | 144493.646 | 73986723.156 | 136986193.568 | 136986193.568 | 153025023.279 |
| 12/6/14 | 20229600.13 | 7125310.813 | 43099012.075 | 106892206.203 | 154347152.839 | 154347152.839 |
| 12/7/14 | 20229600.13 | 5886272.045 | 6366489.978 | 7177782.572 | 8109491.377 | 8109491.377 |
| 12/8/14 | 20229600.13 | 8916581.946 | 8916581.946 | 53144931.926 | 131290455.805 | 188350863.08 |
| 12/9/14 | 16281555.83 | 5121635.818 | 63828316.206 | 77289547.997 | 130504521.778 | 188620514.552 |
| 12/10/14 | 15645638.84 | 6444922.371 | 81051956.792 | 81051956.792 | 105492695.069 | 204646252.871 |
| 12/11/14 | 13897471.27 | 6619347.284 | 44798307.892 | 96714041.295 | 109216901.597 | 170505051.293 |
| 12/12/14 | 11800151.71 | 7811474.503 | 42463009.902 | 110227305.718 | 110227305.718 | 170155396.903 |
| 12/13/14 | 10650307.45 | 7412421.303 | 48413752.69 | 81200946.308 | 129426537.888 | 151119730.301 |
| 12/14/14 | 10650307.45 | 7264954.358 | 32091275.935 | 64252819.218 | 128756880.91 | 140213337.43 |
| 12/15/14 | 10650307.45 | 6171378.572 | 6171378.572 | 46600099.074 | 78949867.472 | 126565663.73 |
| 12/16/14 | 11368333.1 | 9623511.077 | 62706279.003 | 80199321.308 | 106536868.178 | 164237486.377 |
| 12/17/14 | 10115992.01 | 12988042.09 | 81726858.788 | 81726858.788 | 112696673.805 | 184928427.7 |
| 12/18/14 | 11181598.8 | 6446795.941 | 6572305.18 | 6984458.781 | 7035060.391 | 7173788.291 |
| 12/19/14 | 11737127.7 | 12367982.396 | 44928529.124 | 98301567.575 | 98301567.575 | 138946965.921 |
| 12/20/14 | 12921023.44 | 14936853.429 | 54979462.091 | 80124872.567 | 111104089.558 | 135913955.666 |
| 12/21/14 | 12921023.44 | 5611539.123 | 5870274.159 | 6046703.07 | 6512932.317 | 6562401.86 |
| 12/22/14 | 12921023.44 | 14338572.604 | 14338572.604 | 55003408.377 | 80529599.901 | 112001740.039 |
| 12/23/14 | 13333802.13 | 14073739.183 | 52886471.22 | 63608828.256 | 82289787.998 | 115082046.969 |
| 12/24/14 | 17975328.01 | 5483874.193 | 6055422.684 | 6055422.684 | 6313553.278 | 6664095.483 |
| 12/25/14 | 18688327.84 | 15086227.473 | 35183727.798 | 69235967.279 | 78823431.723 | 104263600.059 |
| 12/26/14 | 19400489.11 | 13886346.715 | 24973688.797 | 68036086.521 | 68036086.521 | 94819865.113 |
| 12/27/14 | 19986631.96 | 5795298.233 | 5795298.233 | 6188494.886 | 6387306.279 | 6632020.92 |
| 12/28/14 | 19986631.96 | 13743799.426 | 13743799.426 | 24171003.632 | 64721690.639 | 73697854.039 |
| 12/29/14 | 19986631.96 | 14985379.545 | 14985379.545 | 14985379.545 | 33897497.363 | 65963270.758 |
| 12/30/14 | 20043766.97 | 14593196.757 | 49622838.453 | 49622838.453 | 59836619.075 | 96777272.539 |
| 12/31/14 | 16287426.01 | 14988678.085 | 64557599.995 | 64557599.995 | 64557599.995 | 109817579.517 |